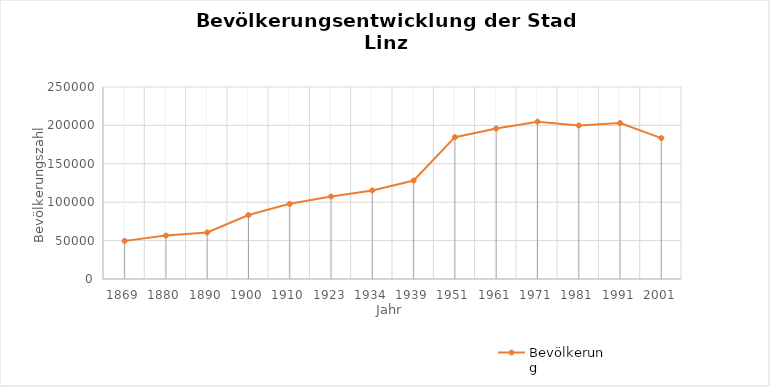
| Category | Bevölkerung |
|---|---|
| 1869.0 | 49635 |
| 1880.0 | 56569 |
| 1890.0 | 60590 |
| 1900.0 | 83356 |
| 1910.0 | 97852 |
| 1923.0 | 107463 |
| 1934.0 | 115338 |
| 1939.0 | 128177 |
| 1951.0 | 184685 |
| 1961.0 | 195978 |
| 1971.0 | 204889 |
| 1981.0 | 199910 |
| 1991.0 | 203044 |
| 2001.0 | 183504 |